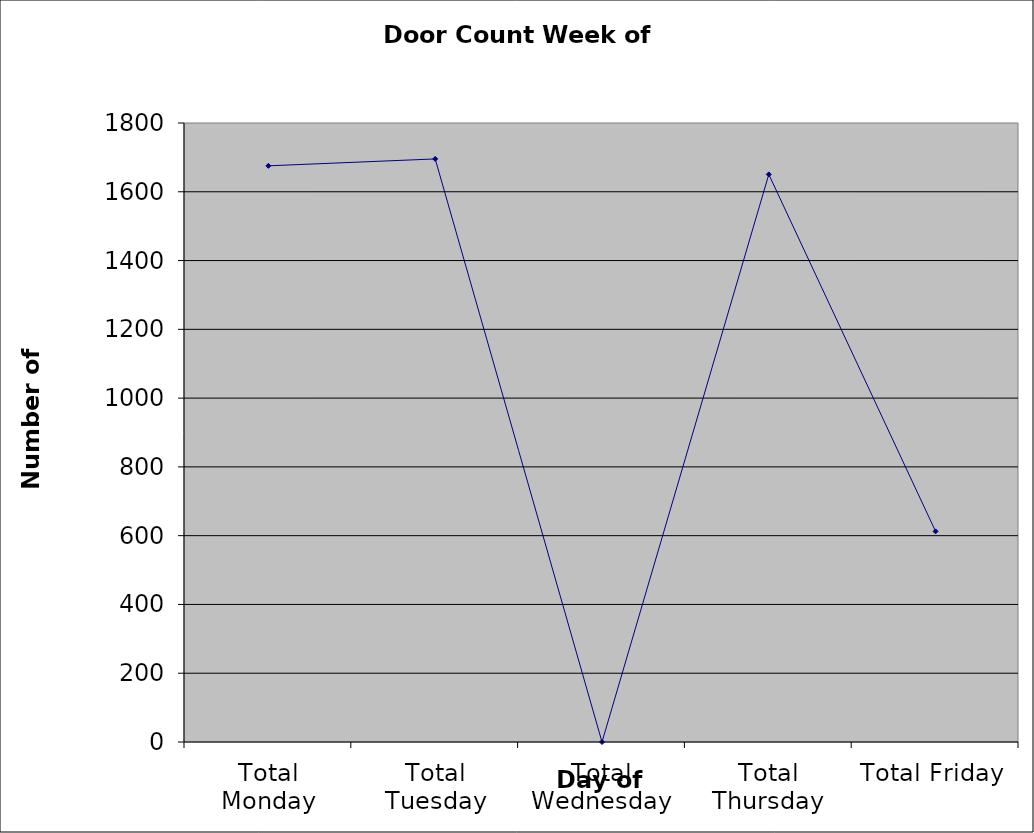
| Category | Series 0 |
|---|---|
| Total Monday | 1675.5 |
| Total Tuesday | 1695.5 |
| Total Wednesday | 0 |
| Total Thursday | 1650.5 |
| Total Friday | 612.5 |